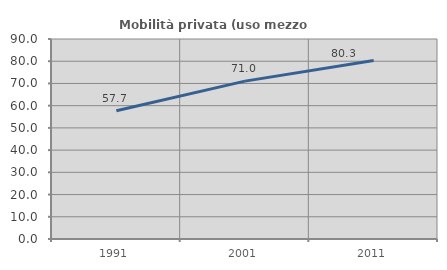
| Category | Mobilità privata (uso mezzo privato) |
|---|---|
| 1991.0 | 57.721 |
| 2001.0 | 71.048 |
| 2011.0 | 80.293 |